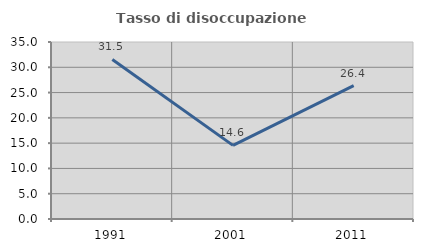
| Category | Tasso di disoccupazione giovanile  |
|---|---|
| 1991.0 | 31.544 |
| 2001.0 | 14.563 |
| 2011.0 | 26.389 |